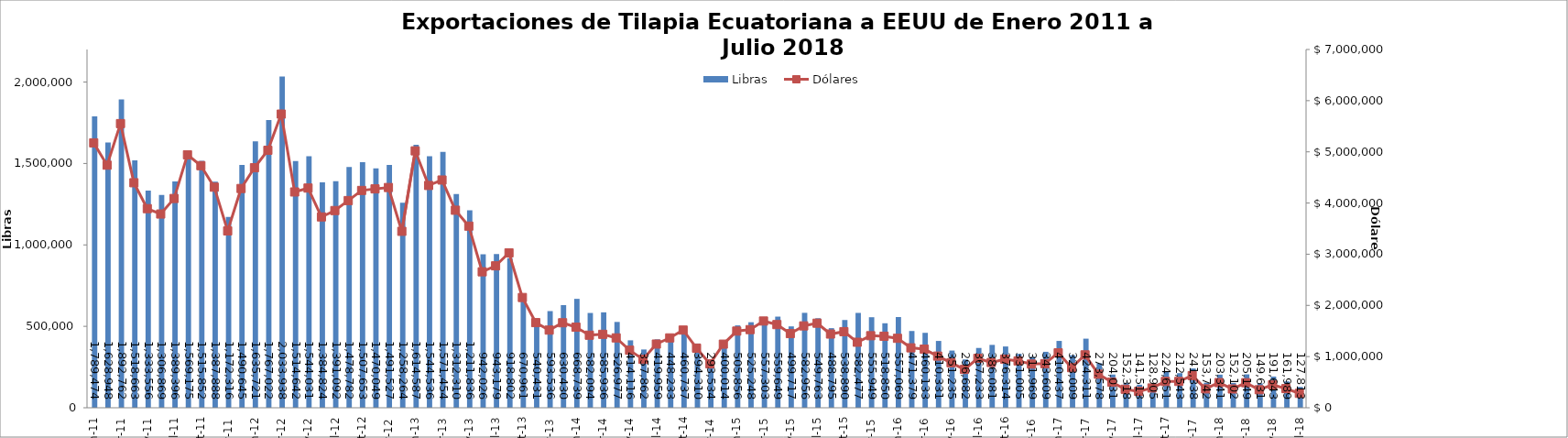
| Category | Libras  |
|---|---|
| 2011-01-01 | 1789473.82 |
| 2011-02-01 | 1628948.076 |
| 2011-03-01 | 1892761.535 |
| 2011-04-01 | 1518662.961 |
| 2011-05-01 | 1333555.926 |
| 2011-06-01 | 1306869.243 |
| 2011-07-01 | 1389396.24 |
| 2011-08-01 | 1569174.756 |
| 2011-09-01 | 1515852.096 |
| 2011-10-01 | 1387888.293 |
| 2011-11-01 | 1172315.891 |
| 2011-12-01 | 1490644.699 |
| 2012-01-01 | 1635720.607 |
| 2012-02-01 | 1767022.174 |
| 2012-03-01 | 2033937.505 |
| 2012-04-01 | 1514641.77 |
| 2012-05-01 | 1544031.293 |
| 2012-06-01 | 1384823.899 |
| 2012-07-01 | 1391091.577 |
| 2012-08-01 | 1478781.747 |
| 2012-09-01 | 1507653.188 |
| 2012-10-01 | 1470049.326 |
| 2012-11-01 | 1491526.539 |
| 2012-12-01 | 1258264 |
| 2013-01-01 | 1614587 |
| 2013-02-01 | 1544536.146 |
| 2013-03-01 | 1571454.312 |
| 2013-04-01 | 1312310.196 |
| 2013-05-01 | 1211835.551 |
| 2013-06-01 | 942025.58 |
| 2013-07-01 | 943178.586 |
| 2013-08-01 | 918802.324 |
| 2013-09-01 | 670961.192 |
| 2013-10-01 | 540431.235 |
| 2013-11-01 | 593535.64 |
| 2013-12-01 | 630429.621 |
| 2014-01-01 | 668739 |
| 2014-02-01 | 582093.766 |
| 2014-03-01 | 585936.383 |
| 2014-04-01 | 526976.561 |
| 2014-05-01 | 414116.473 |
| 2014-06-01 | 357861.695 |
| 2014-07-01 | 419958.663 |
| 2014-08-01 | 448233 |
| 2014-09-01 | 460737.149 |
| 2014-10-01 | 394310.347 |
| 2014-11-01 | 293533.672 |
| 2014-12-01 | 400013.647 |
| 2015-01-01 | 505856.493 |
| 2015-02-01 | 525248 |
| 2015-03-01 | 557303.039 |
| 2015-04-01 | 559648.733 |
| 2015-05-01 | 499716.682 |
| 2015-06-01 | 582955.764 |
| 2015-07-01 | 549763.307 |
| 2015-08-01 | 488795.094 |
| 2015-09-01 | 538890.219 |
| 2015-10-01 | 582477.366 |
| 2015-11-01 | 555949.414 |
| 2015-12-01 | 518850.405 |
| 2016-01-01 | 557069.351 |
| 2016-02-01 | 471378.754 |
| 2016-03-01 | 460133.089 |
| 2016-04-01 | 410331.175 |
| 2016-05-01 | 351235 |
| 2016-06-01 | 296682 |
| 2016-07-01 | 367233.45 |
| 2016-08-01 | 386080.575 |
| 2016-09-01 | 376314.197 |
| 2016-10-01 | 331005.258 |
| 2016-11-01 | 311968.537 |
| 2016-12-01 | 343608.956 |
| 2017-01-01 | 410436.996 |
| 2017-02-01 | 323009.174 |
| 2017-03-01 | 424310.544 |
| 2017-04-01 | 273577.632 |
| 2017-05-01 | 204031.321 |
| 2017-06-01 | 152318.019 |
| 2017-07-01 | 141513.274 |
| 2017-08-01 | 128905.167 |
| 2017-09-01 | 224650.945 |
| 2017-10-01 | 212543.281 |
| 2017-11-01 | 241337.562 |
| 2017-12-01 | 153742.19 |
| 2018-01-01 | 203341.281 |
| 2018-02-01 | 152101.968 |
| 2018-03-01 | 205149.053 |
| 2018-04-01 | 149630.611 |
| 2018-05-01 | 191643 |
| 2018-06-01 | 161989 |
| 2018-07-01 | 127813 |